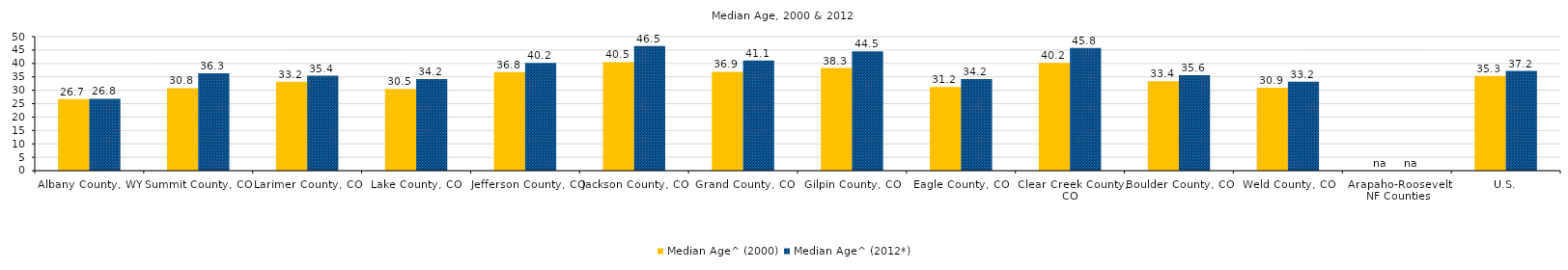
| Category | Median Age^ (2000) | Median Age^ (2012*) |
|---|---|---|
| Gallatin County, MT | 31 | 32 |
| County Region | 0 | 0 |
| U.S. | 35.3 | 36.9 |